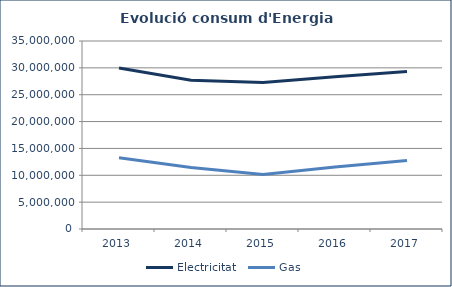
| Category | Electricitat  | Gas |
|---|---|---|
| 2013.0 | 29958213.969 | 13282642 |
| 2014.0 | 27682421.658 | 11441025 |
| 2015.0 | 27258177 | 10127600 |
| 2016.0 | 28355373 | 11526388 |
| 2017.0 | 29324299 | 12732127 |